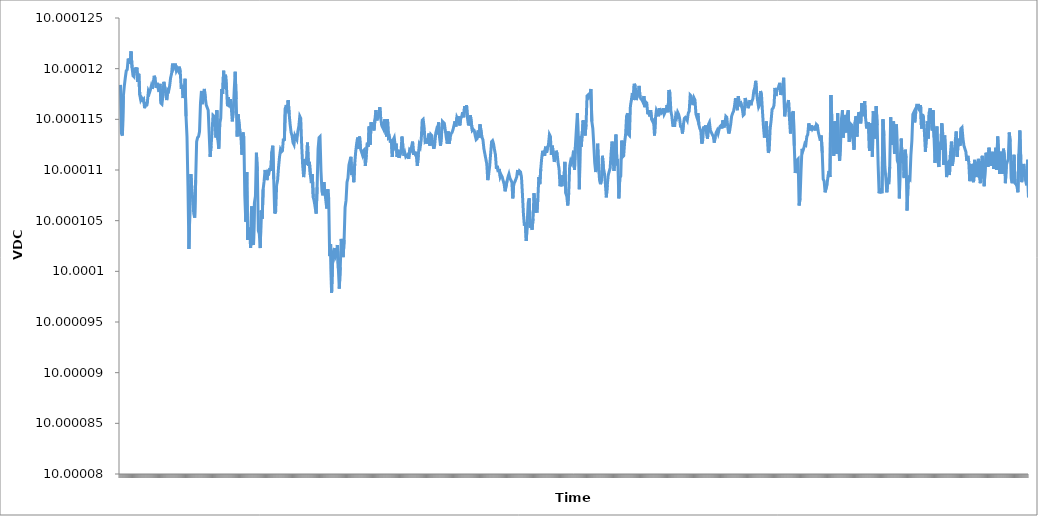
| Category | Channel 1 (VDC) |
|---|---|
| 0 | 10 |
| 1 | 10 |
| 2 | 10 |
| 3 | 10 |
| 4 | 10 |
| 5 | 10 |
| 6 | 10 |
| 7 | 10 |
| 8 | 10 |
| 9 | 10 |
| 10 | 10 |
| 11 | 10 |
| 12 | 10 |
| 13 | 10 |
| 14 | 10 |
| 15 | 10 |
| 16 | 10 |
| 17 | 10 |
| 18 | 10 |
| 19 | 10 |
| 20 | 10 |
| 21 | 10 |
| 22 | 10 |
| 23 | 10 |
| 24 | 10 |
| 25 | 10 |
| 26 | 10 |
| 27 | 10 |
| 28 | 10 |
| 29 | 10 |
| 30 | 10 |
| 31 | 10 |
| 32 | 10 |
| 33 | 10 |
| 34 | 10 |
| 35 | 10 |
| 36 | 10 |
| 37 | 10 |
| 38 | 10 |
| 39 | 10 |
| 40 | 10 |
| 41 | 10 |
| 42 | 10 |
| 43 | 10 |
| 44 | 10 |
| 45 | 10 |
| 46 | 10 |
| 47 | 10 |
| 48 | 10 |
| 49 | 10 |
| 50 | 10 |
| 51 | 10 |
| 52 | 10 |
| 53 | 10 |
| 54 | 10 |
| 55 | 10 |
| 56 | 10 |
| 57 | 10 |
| 58 | 10 |
| 59 | 10 |
| 60 | 10 |
| 61 | 10 |
| 62 | 10 |
| 63 | 10 |
| 64 | 10 |
| 65 | 10 |
| 66 | 10 |
| 67 | 10 |
| 68 | 10 |
| 69 | 10 |
| 70 | 10 |
| 71 | 10 |
| 72 | 10 |
| 73 | 10 |
| 74 | 10 |
| 75 | 10 |
| 76 | 10 |
| 77 | 10 |
| 78 | 10 |
| 79 | 10 |
| 80 | 10 |
| 81 | 10 |
| 82 | 10 |
| 83 | 10 |
| 84 | 10 |
| 85 | 10 |
| 86 | 10 |
| 87 | 10 |
| 88 | 10 |
| 89 | 10 |
| 90 | 10 |
| 91 | 10 |
| 92 | 10 |
| 93 | 10 |
| 94 | 10 |
| 95 | 10 |
| 96 | 10 |
| 97 | 10 |
| 98 | 10 |
| 99 | 10 |
| 100 | 10 |
| 101 | 10 |
| 102 | 10 |
| 103 | 10 |
| 104 | 10 |
| 105 | 10 |
| 106 | 10 |
| 107 | 10 |
| 108 | 10 |
| 109 | 10 |
| 110 | 10 |
| 111 | 10 |
| 112 | 10 |
| 113 | 10 |
| 114 | 10 |
| 115 | 10 |
| 116 | 10 |
| 117 | 10 |
| 118 | 10 |
| 119 | 10 |
| 120 | 10 |
| 121 | 10 |
| 122 | 10 |
| 123 | 10 |
| 124 | 10 |
| 125 | 10 |
| 126 | 10 |
| 127 | 10 |
| 128 | 10 |
| 129 | 10 |
| 130 | 10 |
| 131 | 10 |
| 132 | 10 |
| 133 | 10 |
| 134 | 10 |
| 135 | 10 |
| 136 | 10 |
| 137 | 10 |
| 138 | 10 |
| 139 | 10 |
| 140 | 10 |
| 141 | 10 |
| 142 | 10 |
| 143 | 10 |
| 144 | 10 |
| 145 | 10 |
| 146 | 10 |
| 147 | 10 |
| 148 | 10 |
| 149 | 10 |
| 150 | 10 |
| 151 | 10 |
| 152 | 10 |
| 153 | 10 |
| 154 | 10 |
| 155 | 10 |
| 156 | 10 |
| 157 | 10 |
| 158 | 10 |
| 159 | 10 |
| 160 | 10 |
| 161 | 10 |
| 162 | 10 |
| 163 | 10 |
| 164 | 10 |
| 165 | 10 |
| 166 | 10 |
| 167 | 10 |
| 168 | 10 |
| 169 | 10 |
| 170 | 10 |
| 171 | 10 |
| 172 | 10 |
| 173 | 10 |
| 174 | 10 |
| 175 | 10 |
| 176 | 10 |
| 177 | 10 |
| 178 | 10 |
| 179 | 10 |
| 180 | 10 |
| 181 | 10 |
| 182 | 10 |
| 183 | 10 |
| 184 | 10 |
| 185 | 10 |
| 186 | 10 |
| 187 | 10 |
| 188 | 10 |
| 189 | 10 |
| 190 | 10 |
| 191 | 10 |
| 192 | 10 |
| 193 | 10 |
| 194 | 10 |
| 195 | 10 |
| 196 | 10 |
| 197 | 10 |
| 198 | 10 |
| 199 | 10 |
| 200 | 10 |
| 201 | 10 |
| 202 | 10 |
| 203 | 10 |
| 204 | 10 |
| 205 | 10 |
| 206 | 10 |
| 207 | 10 |
| 208 | 10 |
| 209 | 10 |
| 210 | 10 |
| 211 | 10 |
| 212 | 10 |
| 213 | 10 |
| 214 | 10 |
| 215 | 10 |
| 216 | 10 |
| 217 | 10 |
| 218 | 10 |
| 219 | 10 |
| 220 | 10 |
| 221 | 10 |
| 222 | 10 |
| 223 | 10 |
| 224 | 10 |
| 225 | 10 |
| 226 | 10 |
| 227 | 10 |
| 228 | 10 |
| 229 | 10 |
| 230 | 10 |
| 231 | 10 |
| 232 | 10 |
| 233 | 10 |
| 234 | 10 |
| 235 | 10 |
| 236 | 10 |
| 237 | 10 |
| 238 | 10 |
| 239 | 10 |
| 240 | 10 |
| 241 | 10 |
| 242 | 10 |
| 243 | 10 |
| 244 | 10 |
| 245 | 10 |
| 246 | 10 |
| 247 | 10 |
| 248 | 10 |
| 249 | 10 |
| 250 | 10 |
| 251 | 10 |
| 252 | 10 |
| 253 | 10 |
| 254 | 10 |
| 255 | 10 |
| 256 | 10 |
| 257 | 10 |
| 258 | 10 |
| 259 | 10 |
| 260 | 10 |
| 261 | 10 |
| 262 | 10 |
| 263 | 10 |
| 264 | 10 |
| 265 | 10 |
| 266 | 10 |
| 267 | 10 |
| 268 | 10 |
| 269 | 10 |
| 270 | 10 |
| 271 | 10 |
| 272 | 10 |
| 273 | 10 |
| 274 | 10 |
| 275 | 10 |
| 276 | 10 |
| 277 | 10 |
| 278 | 10 |
| 279 | 10 |
| 280 | 10 |
| 281 | 10 |
| 282 | 10 |
| 283 | 10 |
| 284 | 10 |
| 285 | 10 |
| 286 | 10 |
| 287 | 10 |
| 288 | 10 |
| 289 | 10 |
| 290 | 10 |
| 291 | 10 |
| 292 | 10 |
| 293 | 10 |
| 294 | 10 |
| 295 | 10 |
| 296 | 10 |
| 297 | 10 |
| 298 | 10 |
| 299 | 10 |
| 300 | 10 |
| 301 | 10 |
| 302 | 10 |
| 303 | 10 |
| 304 | 10 |
| 305 | 10 |
| 306 | 10 |
| 307 | 10 |
| 308 | 10 |
| 309 | 10 |
| 310 | 10 |
| 311 | 10 |
| 312 | 10 |
| 313 | 10 |
| 314 | 10 |
| 315 | 10 |
| 316 | 10 |
| 317 | 10 |
| 318 | 10 |
| 319 | 10 |
| 320 | 10 |
| 321 | 10 |
| 322 | 10 |
| 323 | 10 |
| 324 | 10 |
| 325 | 10 |
| 326 | 10 |
| 327 | 10 |
| 328 | 10 |
| 329 | 10 |
| 330 | 10 |
| 331 | 10 |
| 332 | 10 |
| 333 | 10 |
| 334 | 10 |
| 335 | 10 |
| 336 | 10 |
| 337 | 10 |
| 338 | 10 |
| 339 | 10 |
| 340 | 10 |
| 341 | 10 |
| 342 | 10 |
| 343 | 10 |
| 344 | 10 |
| 345 | 10 |
| 346 | 10 |
| 347 | 10 |
| 348 | 10 |
| 349 | 10 |
| 350 | 10 |
| 351 | 10 |
| 352 | 10 |
| 353 | 10 |
| 354 | 10 |
| 355 | 10 |
| 356 | 10 |
| 357 | 10 |
| 358 | 10 |
| 359 | 10 |
| 360 | 10 |
| 361 | 10 |
| 362 | 10 |
| 363 | 10 |
| 364 | 10 |
| 365 | 10 |
| 366 | 10 |
| 367 | 10 |
| 368 | 10 |
| 369 | 10 |
| 370 | 10 |
| 371 | 10 |
| 372 | 10 |
| 373 | 10 |
| 374 | 10 |
| 375 | 10 |
| 376 | 10 |
| 377 | 10 |
| 378 | 10 |
| 379 | 10 |
| 380 | 10 |
| 381 | 10 |
| 382 | 10 |
| 383 | 10 |
| 384 | 10 |
| 385 | 10 |
| 386 | 10 |
| 387 | 10 |
| 388 | 10 |
| 389 | 10 |
| 390 | 10 |
| 391 | 10 |
| 392 | 10 |
| 393 | 10 |
| 394 | 10 |
| 395 | 10 |
| 396 | 10 |
| 397 | 10 |
| 398 | 10 |
| 399 | 10 |
| 400 | 10 |
| 401 | 10 |
| 402 | 10 |
| 403 | 10 |
| 404 | 10 |
| 405 | 10 |
| 406 | 10 |
| 407 | 10 |
| 408 | 10 |
| 409 | 10 |
| 410 | 10 |
| 411 | 10 |
| 412 | 10 |
| 413 | 10 |
| 414 | 10 |
| 415 | 10 |
| 416 | 10 |
| 417 | 10 |
| 418 | 10 |
| 419 | 10 |
| 420 | 10 |
| 421 | 10 |
| 422 | 10 |
| 423 | 10 |
| 424 | 10 |
| 425 | 10 |
| 426 | 10 |
| 427 | 10 |
| 428 | 10 |
| 429 | 10 |
| 430 | 10 |
| 431 | 10 |
| 432 | 10 |
| 433 | 10 |
| 434 | 10 |
| 435 | 10 |
| 436 | 10 |
| 437 | 10 |
| 438 | 10 |
| 439 | 10 |
| 440 | 10 |
| 441 | 10 |
| 442 | 10 |
| 443 | 10 |
| 444 | 10 |
| 445 | 10 |
| 446 | 10 |
| 447 | 10 |
| 448 | 10 |
| 449 | 10 |
| 450 | 10 |
| 451 | 10 |
| 452 | 10 |
| 453 | 10 |
| 454 | 10 |
| 455 | 10 |
| 456 | 10 |
| 457 | 10 |
| 458 | 10 |
| 459 | 10 |
| 460 | 10 |
| 461 | 10 |
| 462 | 10 |
| 463 | 10 |
| 464 | 10 |
| 465 | 10 |
| 466 | 10 |
| 467 | 10 |
| 468 | 10 |
| 469 | 10 |
| 470 | 10 |
| 471 | 10 |
| 472 | 10 |
| 473 | 10 |
| 474 | 10 |
| 475 | 10 |
| 476 | 10 |
| 477 | 10 |
| 478 | 10 |
| 479 | 10 |
| 480 | 10 |
| 481 | 10 |
| 482 | 10 |
| 483 | 10 |
| 484 | 10 |
| 485 | 10 |
| 486 | 10 |
| 487 | 10 |
| 488 | 10 |
| 489 | 10 |
| 490 | 10 |
| 491 | 10 |
| 492 | 10 |
| 493 | 10 |
| 494 | 10 |
| 495 | 10 |
| 496 | 10 |
| 497 | 10 |
| 498 | 10 |
| 499 | 10 |
| 500 | 10 |
| 501 | 10 |
| 502 | 10 |
| 503 | 10 |
| 504 | 10 |
| 505 | 10 |
| 506 | 10 |
| 507 | 10 |
| 508 | 10 |
| 509 | 10 |
| 510 | 10 |
| 511 | 10 |
| 512 | 10 |
| 513 | 10 |
| 514 | 10 |
| 515 | 10 |
| 516 | 10 |
| 517 | 10 |
| 518 | 10 |
| 519 | 10 |
| 520 | 10 |
| 521 | 10 |
| 522 | 10 |
| 523 | 10 |
| 524 | 10 |
| 525 | 10 |
| 526 | 10 |
| 527 | 10 |
| 528 | 10 |
| 529 | 10 |
| 530 | 10 |
| 531 | 10 |
| 532 | 10 |
| 533 | 10 |
| 534 | 10 |
| 535 | 10 |
| 536 | 10 |
| 537 | 10 |
| 538 | 10 |
| 539 | 10 |
| 540 | 10 |
| 541 | 10 |
| 542 | 10 |
| 543 | 10 |
| 544 | 10 |
| 545 | 10 |
| 546 | 10 |
| 547 | 10 |
| 548 | 10 |
| 549 | 10 |
| 550 | 10 |
| 551 | 10 |
| 552 | 10 |
| 553 | 10 |
| 554 | 10 |
| 555 | 10 |
| 556 | 10 |
| 557 | 10 |
| 558 | 10 |
| 559 | 10 |
| 560 | 10 |
| 561 | 10 |
| 562 | 10 |
| 563 | 10 |
| 564 | 10 |
| 565 | 10 |
| 566 | 10 |
| 567 | 10 |
| 568 | 10 |
| 569 | 10 |
| 570 | 10 |
| 571 | 10 |
| 572 | 10 |
| 573 | 10 |
| 574 | 10 |
| 575 | 10 |
| 576 | 10 |
| 577 | 10 |
| 578 | 10 |
| 579 | 10 |
| 580 | 10 |
| 581 | 10 |
| 582 | 10 |
| 583 | 10 |
| 584 | 10 |
| 585 | 10 |
| 586 | 10 |
| 587 | 10 |
| 588 | 10 |
| 589 | 10 |
| 590 | 10 |
| 591 | 10 |
| 592 | 10 |
| 593 | 10 |
| 594 | 10 |
| 595 | 10 |
| 596 | 10 |
| 597 | 10 |
| 598 | 10 |
| 599 | 10 |
| 600 | 10 |
| 601 | 10 |
| 602 | 10 |
| 603 | 10 |
| 604 | 10 |
| 605 | 10 |
| 606 | 10 |
| 607 | 10 |
| 608 | 10 |
| 609 | 10 |
| 610 | 10 |
| 611 | 10 |
| 612 | 10 |
| 613 | 10 |
| 614 | 10 |
| 615 | 10 |
| 616 | 10 |
| 617 | 10 |
| 618 | 10 |
| 619 | 10 |
| 620 | 10 |
| 621 | 10 |
| 622 | 10 |
| 623 | 10 |
| 624 | 10 |
| 625 | 10 |
| 626 | 10 |
| 627 | 10 |
| 628 | 10 |
| 629 | 10 |
| 630 | 10 |
| 631 | 10 |
| 632 | 10 |
| 633 | 10 |
| 634 | 10 |
| 635 | 10 |
| 636 | 10 |
| 637 | 10 |
| 638 | 10 |
| 639 | 10 |
| 640 | 10 |
| 641 | 10 |
| 642 | 10 |
| 643 | 10 |
| 644 | 10 |
| 645 | 10 |
| 646 | 10 |
| 647 | 10 |
| 648 | 10 |
| 649 | 10 |
| 650 | 10 |
| 651 | 10 |
| 652 | 10 |
| 653 | 10 |
| 654 | 10 |
| 655 | 10 |
| 656 | 10 |
| 657 | 10 |
| 658 | 10 |
| 659 | 10 |
| 660 | 10 |
| 661 | 10 |
| 662 | 10 |
| 663 | 10 |
| 664 | 10 |
| 665 | 10 |
| 666 | 10 |
| 667 | 10 |
| 668 | 10 |
| 669 | 10 |
| 670 | 10 |
| 671 | 10 |
| 672 | 10 |
| 673 | 10 |
| 674 | 10 |
| 675 | 10 |
| 676 | 10 |
| 677 | 10 |
| 678 | 10 |
| 679 | 10 |
| 680 | 10 |
| 681 | 10 |
| 682 | 10 |
| 683 | 10 |
| 684 | 10 |
| 685 | 10 |
| 686 | 10 |
| 687 | 10 |
| 688 | 10 |
| 689 | 10 |
| 690 | 10 |
| 691 | 10 |
| 692 | 10 |
| 693 | 10 |
| 694 | 10 |
| 695 | 10 |
| 696 | 10 |
| 697 | 10 |
| 698 | 10 |
| 699 | 10 |
| 700 | 10 |
| 701 | 10 |
| 702 | 10 |
| 703 | 10 |
| 704 | 10 |
| 705 | 10 |
| 706 | 10 |
| 707 | 10 |
| 708 | 10 |
| 709 | 10 |
| 710 | 10 |
| 711 | 10 |
| 712 | 10 |
| 713 | 10 |
| 714 | 10 |
| 715 | 10 |
| 716 | 10 |
| 717 | 10 |
| 718 | 10 |
| 719 | 10 |
| 720 | 10 |
| 721 | 10 |
| 722 | 10 |
| 723 | 10 |
| 724 | 10 |
| 725 | 10 |
| 726 | 10 |
| 727 | 10 |
| 728 | 10 |
| 729 | 10 |
| 730 | 10 |
| 731 | 10 |
| 732 | 10 |
| 733 | 10 |
| 734 | 10 |
| 735 | 10 |
| 736 | 10 |
| 737 | 10 |
| 738 | 10 |
| 739 | 10 |
| 740 | 10 |
| 741 | 10 |
| 742 | 10 |
| 743 | 10 |
| 744 | 10 |
| 745 | 10 |
| 746 | 10 |
| 747 | 10 |
| 748 | 10 |
| 749 | 10 |
| 750 | 10 |
| 751 | 10 |
| 752 | 10 |
| 753 | 10 |
| 754 | 10 |
| 755 | 10 |
| 756 | 10 |
| 757 | 10 |
| 758 | 10 |
| 759 | 10 |
| 760 | 10 |
| 761 | 10 |
| 762 | 10 |
| 763 | 10 |
| 764 | 10 |
| 765 | 10 |
| 766 | 10 |
| 767 | 10 |
| 768 | 10 |
| 769 | 10 |
| 770 | 10 |
| 771 | 10 |
| 772 | 10 |
| 773 | 10 |
| 774 | 10 |
| 775 | 10 |
| 776 | 10 |
| 777 | 10 |
| 778 | 10 |
| 779 | 10 |
| 780 | 10 |
| 781 | 10 |
| 782 | 10 |
| 783 | 10 |
| 784 | 10 |
| 785 | 10 |
| 786 | 10 |
| 787 | 10 |
| 788 | 10 |
| 789 | 10 |
| 790 | 10 |
| 791 | 10 |
| 792 | 10 |
| 793 | 10 |
| 794 | 10 |
| 795 | 10 |
| 796 | 10 |
| 797 | 10 |
| 798 | 10 |
| 799 | 10 |
| 800 | 10 |
| 801 | 10 |
| 802 | 10 |
| 803 | 10 |
| 804 | 10 |
| 805 | 10 |
| 806 | 10 |
| 807 | 10 |
| 808 | 10 |
| 809 | 10 |
| 810 | 10 |
| 811 | 10 |
| 812 | 10 |
| 813 | 10 |
| 814 | 10 |
| 815 | 10 |
| 816 | 10 |
| 817 | 10 |
| 818 | 10 |
| 819 | 10 |
| 820 | 10 |
| 821 | 10 |
| 822 | 10 |
| 823 | 10 |
| 824 | 10 |
| 825 | 10 |
| 826 | 10 |
| 827 | 10 |
| 828 | 10 |
| 829 | 10 |
| 830 | 10 |
| 831 | 10 |
| 832 | 10 |
| 833 | 10 |
| 834 | 10 |
| 835 | 10 |
| 836 | 10 |
| 837 | 10 |
| 838 | 10 |
| 839 | 10 |
| 840 | 10 |
| 841 | 10 |
| 842 | 10 |
| 843 | 10 |
| 844 | 10 |
| 845 | 10 |
| 846 | 10 |
| 847 | 10 |
| 848 | 10 |
| 849 | 10 |
| 850 | 10 |
| 851 | 10 |
| 852 | 10 |
| 853 | 10 |
| 854 | 10 |
| 855 | 10 |
| 856 | 10 |
| 857 | 10 |
| 858 | 10 |
| 859 | 10 |
| 860 | 10 |
| 861 | 10 |
| 862 | 10 |
| 863 | 10 |
| 864 | 10 |
| 865 | 10 |
| 866 | 10 |
| 867 | 10 |
| 868 | 10 |
| 869 | 10 |
| 870 | 10 |
| 871 | 10 |
| 872 | 10 |
| 873 | 10 |
| 874 | 10 |
| 875 | 10 |
| 876 | 10 |
| 877 | 10 |
| 878 | 10 |
| 879 | 10 |
| 880 | 10 |
| 881 | 10 |
| 882 | 10 |
| 883 | 10 |
| 884 | 10 |
| 885 | 10 |
| 886 | 10 |
| 887 | 10 |
| 888 | 10 |
| 889 | 10 |
| 890 | 10 |
| 891 | 10 |
| 892 | 10 |
| 893 | 10 |
| 894 | 10 |
| 895 | 10 |
| 896 | 10 |
| 897 | 10 |
| 898 | 10 |
| 899 | 10 |
| 900 | 10 |
| 901 | 10 |
| 902 | 10 |
| 903 | 10 |
| 904 | 10 |
| 905 | 10 |
| 906 | 10 |
| 907 | 10 |
| 908 | 10 |
| 909 | 10 |
| 910 | 10 |
| 911 | 10 |
| 912 | 10 |
| 913 | 10 |
| 914 | 10 |
| 915 | 10 |
| 916 | 10 |
| 917 | 10 |
| 918 | 10 |
| 919 | 10 |
| 920 | 10 |
| 921 | 10 |
| 922 | 10 |
| 923 | 10 |
| 924 | 10 |
| 925 | 10 |
| 926 | 10 |
| 927 | 10 |
| 928 | 10 |
| 929 | 10 |
| 930 | 10 |
| 931 | 10 |
| 932 | 10 |
| 933 | 10 |
| 934 | 10 |
| 935 | 10 |
| 936 | 10 |
| 937 | 10 |
| 938 | 10 |
| 939 | 10 |
| 940 | 10 |
| 941 | 10 |
| 942 | 10 |